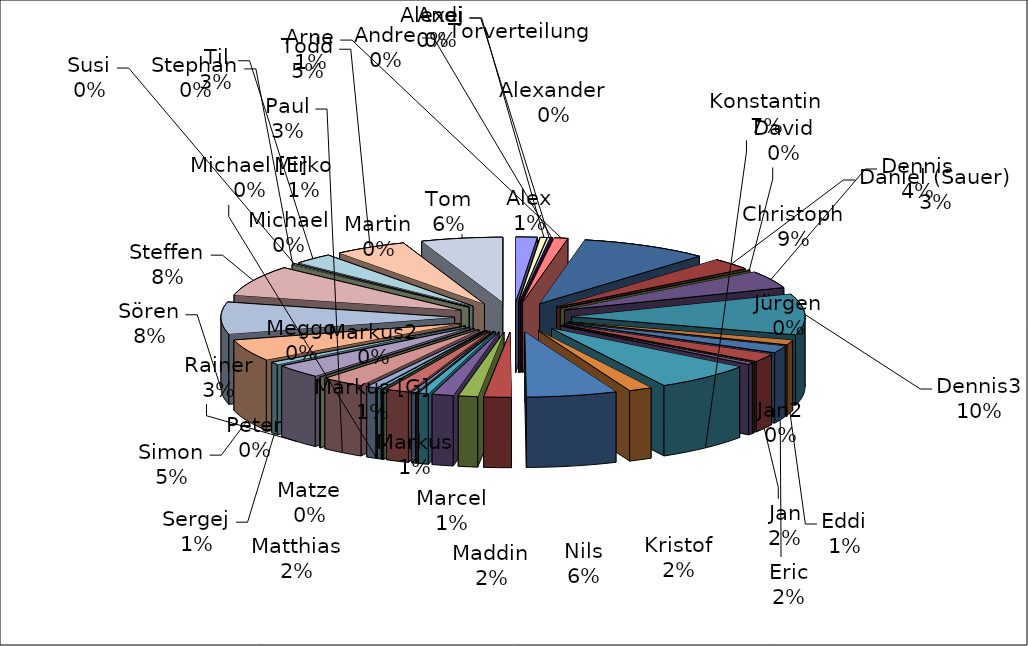
| Category | Series 0 |
|---|---|
| Alex | 21 |
| Alexander | 0 |
| Alexej | 6 |
| Andi | 2 |
| Andre | 2 |
| Arne | 13 |
| Christoph | 126 |
| Daniel (Sauer) | 42 |
| David | 2 |
| Dennis | 61 |
| Dennis3 | 144 |
| Eddi | 17 |
| Eric | 25 |
| Jan | 29 |
| Jan2 | 2 |
| Jürgen | 6 |
| Konstantin | 98 |
| Kristof | 23 |
| Nils | 89 |
| Maddin | 27 |
| Marcel | 19 |
| Markus | 21 |
| Markus [G] | 10 |
| Markus2 | 1 |
| Martin | 4 |
| Matthias | 23 |
| Matze | 1 |
| Meggo | 1 |
| Michael | 4 |
| Michael [E] | 0 |
| Mirko | 10 |
| Paul | 43 |
| Peter | 1 |
| Rainer | 48 |
| Sergej | 9 |
| Simon | 76 |
| Sören | 112 |
| Steffen | 107 |
| Stephan | 2 |
| Susi | 2 |
| Til | 39 |
| Todd | 71 |
| Tom | 80 |